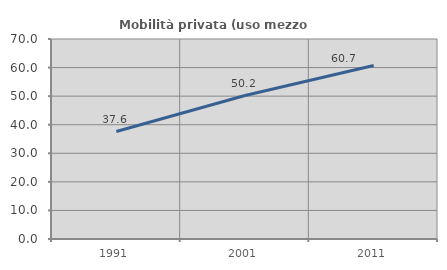
| Category | Mobilità privata (uso mezzo privato) |
|---|---|
| 1991.0 | 37.62 |
| 2001.0 | 50.208 |
| 2011.0 | 60.732 |